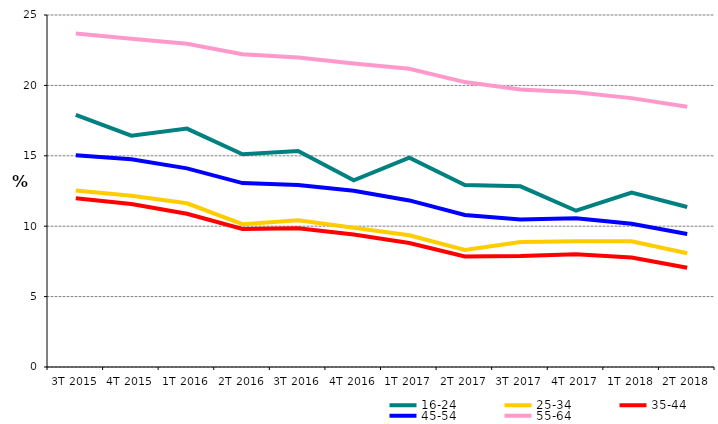
| Category | 16-24 | 25-34 | 35-44 | 45-54 | 55-64 |
|---|---|---|---|---|---|
| 3T 2015 | 17.899 | 12.53 | 11.979 | 15.035 | 23.679 |
| 4T 2015 | 16.43 | 12.16 | 11.581 | 14.748 | 23.317 |
| 1T 2016 | 16.932 | 11.627 | 10.888 | 14.106 | 22.956 |
| 2T 2016 | 15.111 | 10.142 | 9.802 | 13.063 | 22.21 |
| 3T 2016 | 15.346 | 10.419 | 9.851 | 12.93 | 21.98 |
| 4T 2016 | 13.262 | 9.892 | 9.412 | 12.52 | 21.549 |
| 1T 2017 | 14.873 | 9.351 | 8.807 | 11.83 | 21.182 |
| 2T 2017 | 12.924 | 8.31 | 7.847 | 10.794 | 20.235 |
| 3T 2017 | 12.829 | 8.871 | 7.879 | 10.475 | 19.702 |
| 4T 2017 | 11.1 | 8.924 | 8.009 | 10.571 | 19.514 |
| 1T 2018 | 12.381 | 8.932 | 7.769 | 10.175 | 19.096 |
| 2T 2018 | 11.366 | 8.079 | 7.045 | 9.452 | 18.486 |